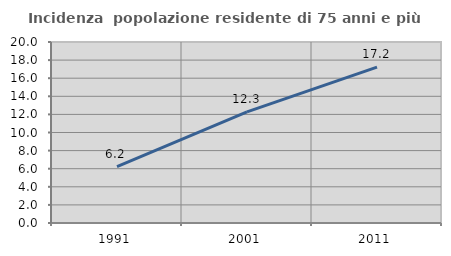
| Category | Incidenza  popolazione residente di 75 anni e più |
|---|---|
| 1991.0 | 6.221 |
| 2001.0 | 12.281 |
| 2011.0 | 17.222 |